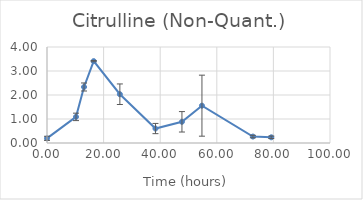
| Category | Series 0 |
|---|---|
| 0.0 | 0.194 |
| 10.250000000058208 | 1.089 |
| 13.083333333372138 | 2.334 |
| 16.5 | 3.411 |
| 25.749999999941792 | 2.032 |
| 38.33333333325572 | 0.602 |
| 47.683333333348855 | 0.883 |
| 54.75 | 1.555 |
| 72.75 | 0.268 |
| 79.25000000005821 | 0.237 |